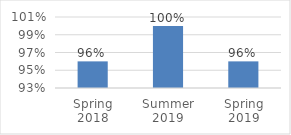
| Category | Series 0 |
|---|---|
| Spring 2018 | 0.96 |
| Summer 2019 | 1 |
| Spring 2019 | 0.96 |